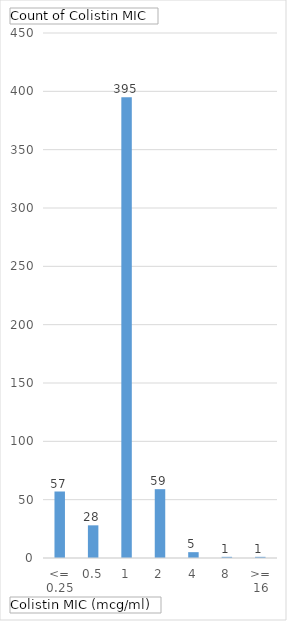
| Category | Total |
|---|---|
| <= 0.25 | 57 |
| 0.5 | 28 |
| 1 | 395 |
| 2 | 59 |
| 4 | 5 |
| 8 | 1 |
| >= 16 | 1 |